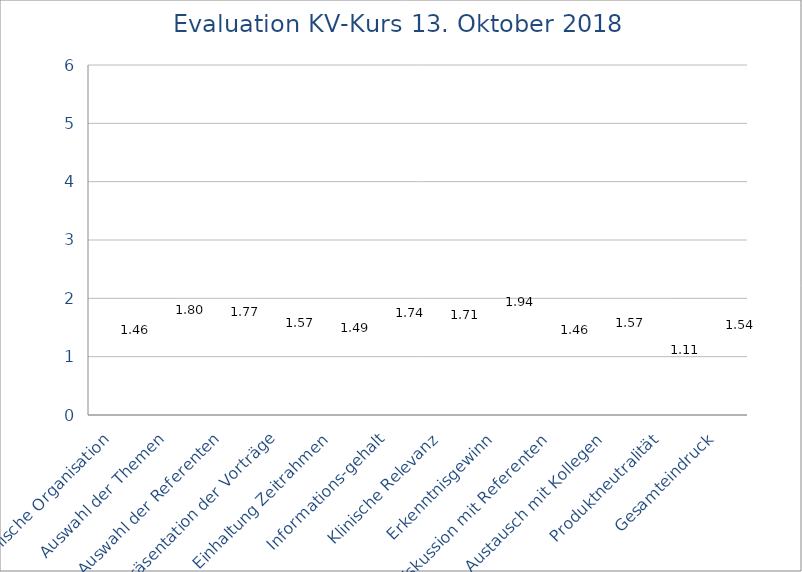
| Category | max. | min. | Mittel | Series 3 |
|---|---|---|---|---|
| Technische Organisation | 3 | 1 | 1.457 |  |
| Auswahl der Themen | 3 | 1 | 1.8 |  |
| Auswahl der Referenten | 3 | 1 | 1.771 |  |
| Präsentation der Vorträge | 3 | 1 | 1.571 |  |
| Einhaltung Zeitrahmen | 3 | 1 | 1.486 |  |
| Informations-gehalt | 3 | 1 | 1.743 |  |
| Klinische Relevanz | 3 | 1 | 1.714 |  |
| Erkenntnisgewinn | 4 | 1 | 1.943 |  |
| Diskussion mit Referenten | 3 | 1 | 1.457 |  |
| Austausch mit Kollegen | 6 | 1 | 1.571 |  |
| Produktneutralität | 2 | 1 | 1.114 |  |
| Gesamteindruck | 3 | 1 | 1.543 |  |